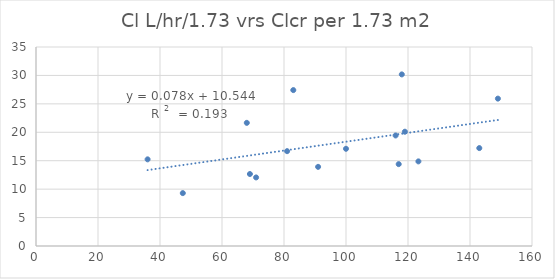
| Category | Series 0 |
|---|---|
| 83.0 | 27.42 |
| 81.0 | 16.68 |
| 36.0 | 15.24 |
| 100.0 | 17.1 |
| 143.0 | 17.22 |
| 91.0 | 13.92 |
| 117.0 | 14.4 |
| 118.0 | 30.18 |
| 119.0 | 20.1 |
| 149.0 | 25.92 |
| 68.0 | 21.66 |
| 71.0 | 12.06 |
| 123.35721252852899 | 14.88 |
| 47.355345873071066 | 9.3 |
| 69.0 | 12.66 |
| 116.0 | 19.44 |